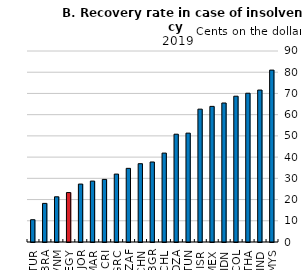
| Category | Recovery rate in case of insolvency, cents on the dollar, 2019 |
|---|---|
| TUR | 10.5 |
| BRA | 18.2 |
| VNM | 21.3 |
| EGY | 23.3 |
| JOR | 27.3 |
| MAR | 28.7 |
| CRI | 29.5 |
| GRC | 32 |
| ZAF | 34.7 |
| CHN | 36.9 |
| BGR | 37.7 |
| CHL | 41.9 |
| DZA | 50.8 |
| TUN | 51.3 |
| ISR | 62.6 |
| MEX | 63.9 |
| IDN | 65.5 |
| COL | 68.7 |
| THA | 70.1 |
| IND | 71.6 |
| MYS | 81 |